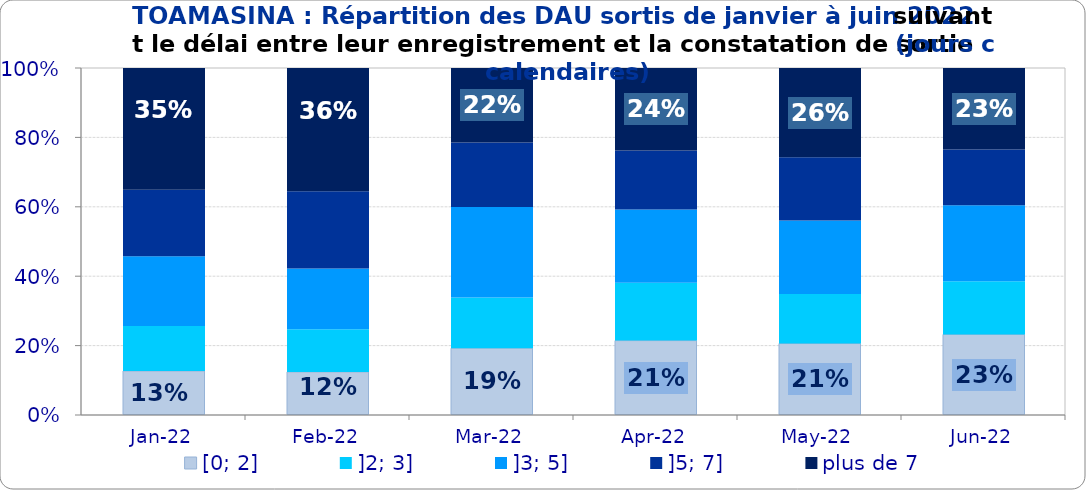
| Category | [0; 2] | ]2; 3] | ]3; 5] | ]5; 7] | plus de 7 |
|---|---|---|---|---|---|
| 2022-01-01 | 0.127 | 0.13 | 0.201 | 0.192 | 0.351 |
| 2022-02-01 | 0.124 | 0.123 | 0.175 | 0.222 | 0.356 |
| 2022-03-01 | 0.192 | 0.146 | 0.261 | 0.186 | 0.215 |
| 2022-04-01 | 0.214 | 0.166 | 0.211 | 0.17 | 0.237 |
| 2022-05-01 | 0.206 | 0.143 | 0.212 | 0.182 | 0.257 |
| 2022-06-01 | 0.232 | 0.153 | 0.219 | 0.16 | 0.235 |